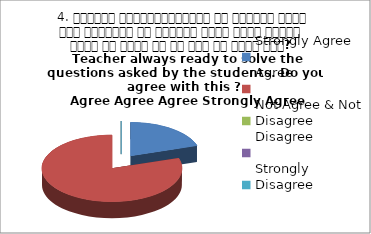
| Category | 4. शिक्षक विद्यार्थियों के द्वारा पूछे गये प्रश्नो का समाधान करने हेतु तत्पर  रहते है क्या आप इस बात से सहमत हैं? 
 Teacher always ready to solve the questions asked by the students. Do you agree with this ? 
 Agree Agree Agree Strongly Agree Agree |
|---|---|
| Strongly Agree | 1 |
| Agree | 4 |
| Not Agree & Not Disagree | 0 |
| Disagree | 0 |
| Strongly Disagree | 0 |